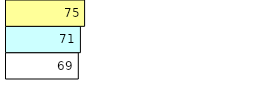
| Category | Total Standouts | Total Recd | Total Tipsters |
|---|---|---|---|
| 0 | 69 | 71 | 75 |